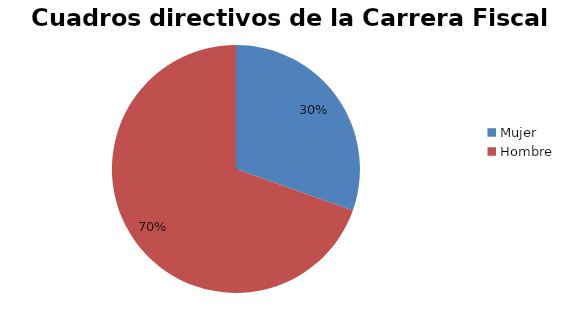
| Category | Series 0 |
|---|---|
| Mujer | 35 |
| Hombre | 80 |